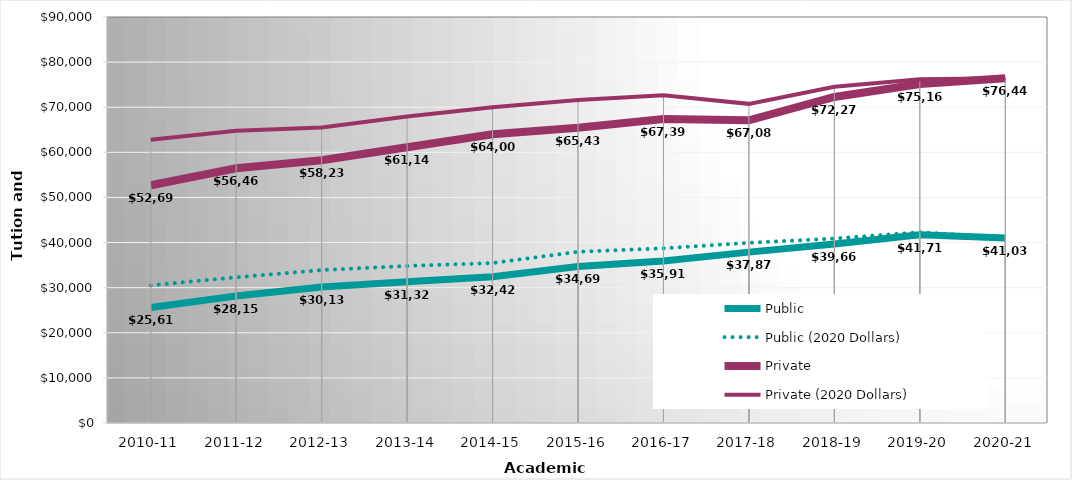
| Category | Public | Public (2020 Dollars) | Private | Private (2020 Dollars) |
|---|---|---|---|---|
| 2010-11 | 25618 | 30525.01 | 52697 | 62790.87 |
| 2011-12 | 28151 | 32293.95 | 56463 | 64772.6 |
| 2012-13 | 30137 | 33897.24 | 58238 | 65504.44 |
| 2013-14 | 31322 | 34817.53 | 61143 | 67966.55 |
| 2014-15 | 32426 | 35456.89 | 64004 | 69986.52 |
| 2015-16 | 34695.56 | 37952.3 | 65437.27 | 71579.32 |
| 2016-17 | 35916.95 | 38721.54 | 67398.89 | 72661.88 |
| 2017-18 | 37877.21 | 39942.96 | 67086.74 | 70745.51 |
| 2018-19 | 39661.92 | 40893.86 | 72270.85 | 74515.65 |
| 2019-20 | 41711.28 | 42283.28 | 75160.74 | 76191.44 |
| 2020-21 | 41032.69 | 41032.69 | 76447.33 | 76447.33 |